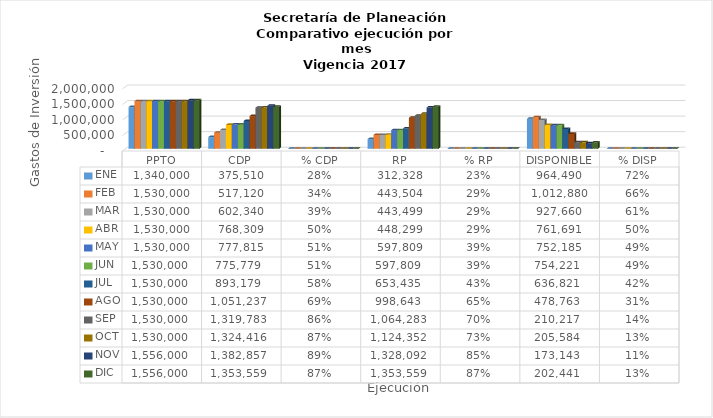
| Category | ENE | FEB | MAR | ABR | MAY  | JUN  | JUL | AGO | SEP | OCT | NOV | DIC |
|---|---|---|---|---|---|---|---|---|---|---|---|---|
| PPTO | 1340000 | 1530000 | 1530000 | 1530000 | 1530000 | 1530000 | 1530000 | 1530000 | 1530000 | 1530000 | 1556000 | 1556000 |
| CDP | 375510 | 517120 | 602340 | 768309.3 | 777814.993 | 775778.509 | 893179.075 | 1051236.875 | 1319782.758 | 1324416.091 | 1382856.618 | 1353559.286 |
| % CDP | 0.28 | 0.338 | 0.394 | 0.502 | 0.508 | 0.507 | 0.584 | 0.687 | 0.863 | 0.866 | 0.889 | 0.87 |
| RP | 312328.36 | 443503.876 | 443499.209 | 448299.209 | 597809.209 | 597809.209 | 653434.975 | 998642.758 | 1064282.758 | 1124352.091 | 1328092.191 | 1353559.286 |
| % RP | 0.233 | 0.29 | 0.29 | 0.293 | 0.391 | 0.391 | 0.427 | 0.653 | 0.696 | 0.735 | 0.854 | 0.87 |
| DISPONIBLE | 964490 | 1012880 | 927660 | 761690.7 | 752185.007 | 754221.491 | 636820.925 | 478763.125 | 210217.242 | 205583.909 | 173143.382 | 202440.714 |
| % DISP | 0.72 | 0.662 | 0.606 | 0.498 | 0.492 | 0.493 | 0.416 | 0.313 | 0.137 | 0.134 | 0.111 | 0.13 |